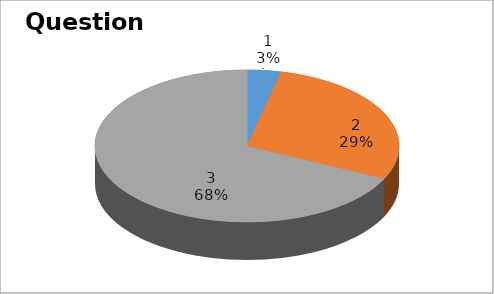
| Category | Series 0 |
|---|---|
| 0 | 1 |
| 1 | 8 |
| 2 | 19 |